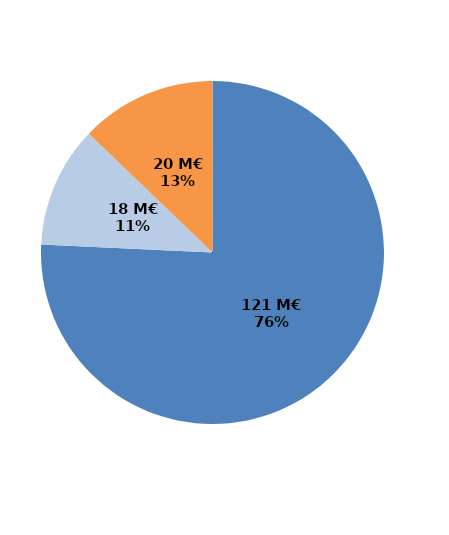
| Category | Series 0 |
|---|---|
| Formations certifiantes et pré-certifiantes | 120.52 |
| Formations professionnalisantes | 18.192 |
| Formations d'insertion sociale et professionnelle | 20.394 |